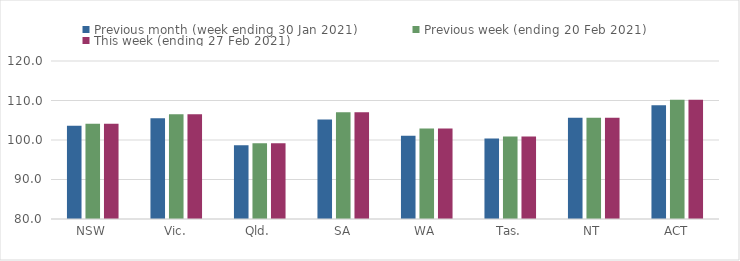
| Category | Previous month (week ending 30 Jan 2021) | Previous week (ending 20 Feb 2021) | This week (ending 27 Feb 2021) |
|---|---|---|---|
| NSW | 103.61 | 104.1 | 104.1 |
| Vic. | 105.51 | 106.5 | 106.5 |
| Qld. | 98.67 | 99.15 | 99.15 |
| SA | 105.17 | 107.03 | 107.03 |
| WA | 101.06 | 102.91 | 102.91 |
| Tas. | 100.36 | 100.9 | 100.9 |
| NT | 105.66 | 105.66 | 105.66 |
| ACT | 108.79 | 110.2 | 110.2 |